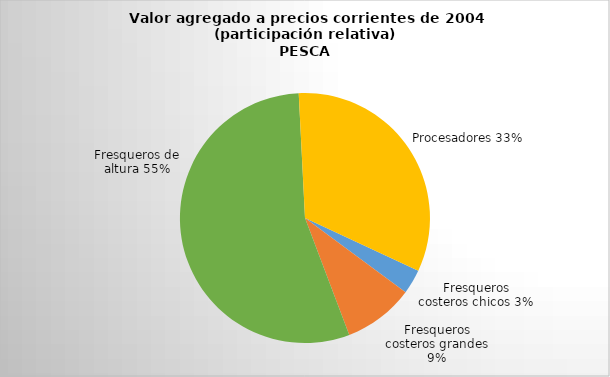
| Category | Series 0 |
|---|---|
| Fresqueros costeros chicos | 13.086 |
| Fresqueros costeros grandes | 37.489 |
| Fresqueros de altura | 226.053 |
| Procesadores | 134.679 |